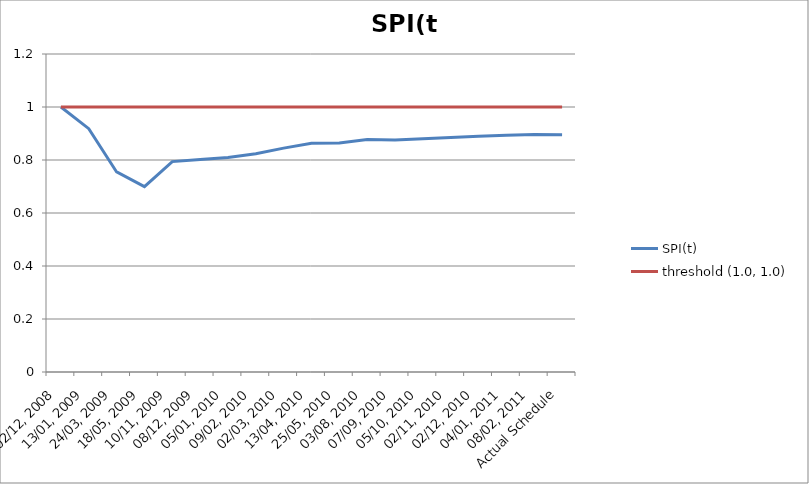
| Category | SPI(t) | threshold (1.0, 1.0) |
|---|---|---|
| 02/12, 2008 | 1 | 1 |
| 13/01, 2009 | 0.918 | 1 |
| 24/03, 2009 | 0.755 | 1 |
| 18/05, 2009 | 0.699 | 1 |
| 10/11, 2009 | 0.794 | 1 |
| 08/12, 2009 | 0.802 | 1 |
| 05/01, 2010 | 0.81 | 1 |
| 09/02, 2010 | 0.824 | 1 |
| 02/03, 2010 | 0.845 | 1 |
| 13/04, 2010 | 0.863 | 1 |
| 25/05, 2010 | 0.864 | 1 |
| 03/08, 2010 | 0.877 | 1 |
| 07/09, 2010 | 0.876 | 1 |
| 05/10, 2010 | 0.88 | 1 |
| 02/11, 2010 | 0.885 | 1 |
| 02/12, 2010 | 0.889 | 1 |
| 04/01, 2011 | 0.893 | 1 |
| 08/02, 2011 | 0.896 | 1 |
| Actual Schedule | 0.895 | 1 |